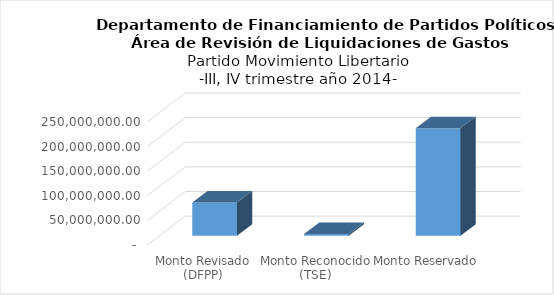
| Category | Series 0 |
|---|---|
| Monto Revisado (DFPP) | 67693545.92 |
| Monto Reconocido (TSE) | 3508651.4 |
| Monto Reservado  | 218328030.981 |